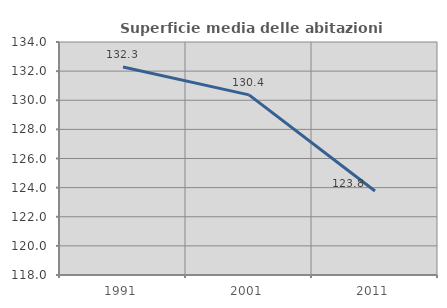
| Category | Superficie media delle abitazioni occupate |
|---|---|
| 1991.0 | 132.283 |
| 2001.0 | 130.37 |
| 2011.0 | 123.765 |